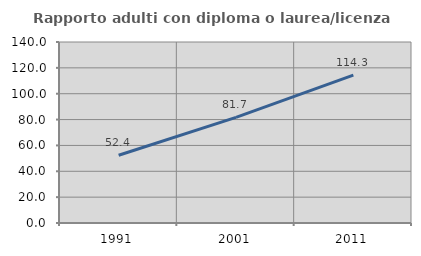
| Category | Rapporto adulti con diploma o laurea/licenza media  |
|---|---|
| 1991.0 | 52.406 |
| 2001.0 | 81.694 |
| 2011.0 | 114.324 |